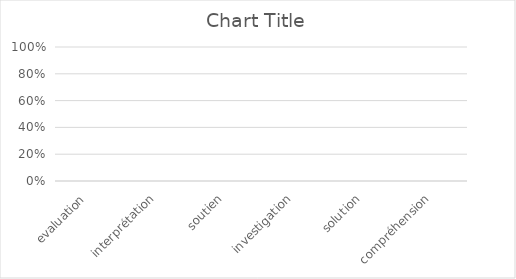
| Category | Series 0 |
|---|---|
| evaluation | 0 |
| interprétation | 0 |
| soutien | 0 |
| investigation | 0 |
| solution | 0 |
| compréhension | 0 |